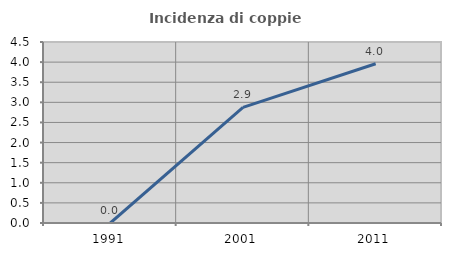
| Category | Incidenza di coppie miste |
|---|---|
| 1991.0 | 0 |
| 2001.0 | 2.875 |
| 2011.0 | 3.96 |